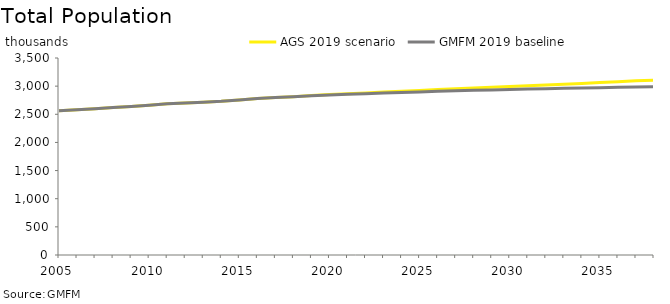
| Category | AGS 2019 scenario | GMFM 2019 baseline |
|---|---|---|
| 2005.0 | 2564.397 | 2564.397 |
| 2006.0 | 2582.684 | 2582.684 |
| 2007.0 | 2599.081 | 2599.081 |
| 2008.0 | 2620.407 | 2620.407 |
| 2009.0 | 2640.11 | 2640.11 |
| 2010.0 | 2662.073 | 2662.073 |
| 2011.0 | 2685.588 | 2685.588 |
| 2012.0 | 2701.579 | 2701.579 |
| 2013.0 | 2713.774 | 2713.774 |
| 2014.0 | 2730.325 | 2730.325 |
| 2015.0 | 2754.219 | 2754.219 |
| 2016.0 | 2781.046 | 2781.046 |
| 2017.0 | 2799.001 | 2799.001 |
| 2018.0 | 2812.771 | 2812.771 |
| 2019.0 | 2832.405 | 2829.238 |
| 2020.0 | 2849.782 | 2843.151 |
| 2021.0 | 2865.015 | 2854.809 |
| 2022.0 | 2879.839 | 2865.938 |
| 2023.0 | 2894.775 | 2877.052 |
| 2024.0 | 2909.662 | 2887.833 |
| 2025.0 | 2924.017 | 2897.755 |
| 2026.0 | 2938.436 | 2907.354 |
| 2027.0 | 2952.599 | 2916.479 |
| 2028.0 | 2966.376 | 2924.978 |
| 2029.0 | 2979.897 | 2932.957 |
| 2030.0 | 2993.303 | 2940.529 |
| 2031.0 | 3006.721 | 2947.789 |
| 2032.0 | 3020.65 | 2954.79 |
| 2033.0 | 3034.472 | 2961.223 |
| 2034.0 | 3048.953 | 2967.177 |
| 2035.0 | 3064.005 | 2972.993 |
| 2036.0 | 3078.757 | 2978.508 |
| 2037.0 | 3094.7 | 2983.857 |
| 2038.0 | 3103.689 | 2988.919 |